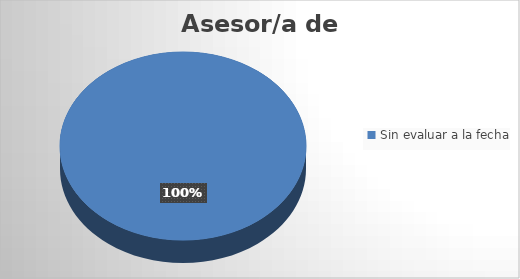
| Category | Cantidad |
|---|---|
| Sin evaluar a la fecha | 1 |